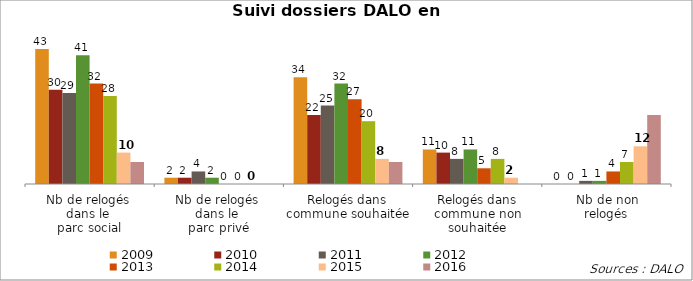
| Category | 2009 | 2010 | 2011 | 2012 | 2013 | 2014 | 2015 | 2016 |
|---|---|---|---|---|---|---|---|---|
| Nb de relogés 
dans le 
parc social | 43 | 30 | 29 | 41 | 32 | 28 | 10 | 7 |
| Nb de relogés 
dans le 
parc privé | 2 | 2 | 4 | 2 | 0 | 0 | 0 | 0 |
| Relogés dans commune souhaitée | 34 | 22 | 25 | 32 | 27 | 20 | 8 | 7 |
| Relogés dans commune non souhaitée | 11 | 10 | 8 | 11 | 5 | 8 | 2 | 0 |
| Nb de non
relogés | 0 | 0 | 1 | 1 | 4 | 7 | 12 | 22 |